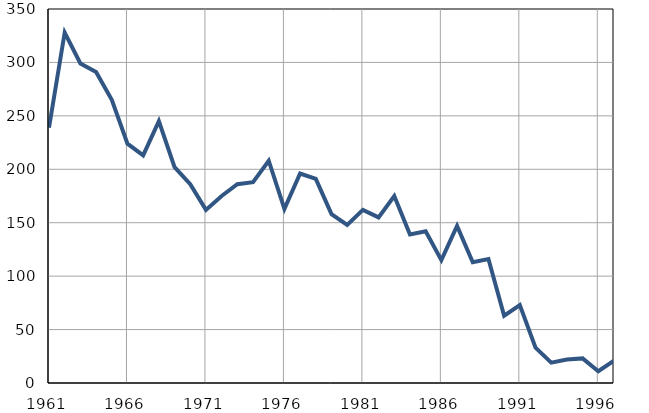
| Category | Умрла 
одојчад |
|---|---|
| 1961.0 | 239 |
| 1962.0 | 328 |
| 1963.0 | 299 |
| 1964.0 | 291 |
| 1965.0 | 265 |
| 1966.0 | 224 |
| 1967.0 | 213 |
| 1968.0 | 245 |
| 1969.0 | 202 |
| 1970.0 | 186 |
| 1971.0 | 162 |
| 1972.0 | 175 |
| 1973.0 | 186 |
| 1974.0 | 188 |
| 1975.0 | 208 |
| 1976.0 | 163 |
| 1977.0 | 196 |
| 1978.0 | 191 |
| 1979.0 | 158 |
| 1980.0 | 148 |
| 1981.0 | 162 |
| 1982.0 | 155 |
| 1983.0 | 175 |
| 1984.0 | 139 |
| 1985.0 | 142 |
| 1986.0 | 115 |
| 1987.0 | 147 |
| 1988.0 | 113 |
| 1989.0 | 116 |
| 1990.0 | 63 |
| 1991.0 | 73 |
| 1992.0 | 33 |
| 1993.0 | 19 |
| 1994.0 | 22 |
| 1995.0 | 23 |
| 1996.0 | 11 |
| 1997.0 | 21 |